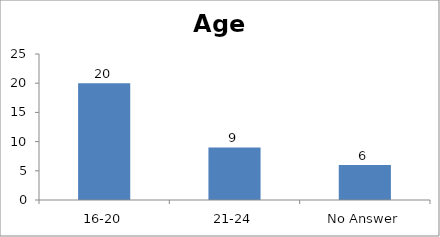
| Category | Age |
|---|---|
| 16-20 | 20 |
| 21-24 | 9 |
| No Answer | 6 |